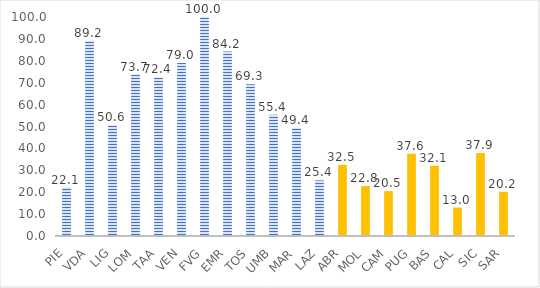
| Category | nidi e sezioni primavera |
|---|---|
| PIE | 22.1 |
| VDA | 89.2 |
| LIG | 50.6 |
| LOM | 73.7 |
| TAA | 72.4 |
| VEN | 79 |
| FVG | 100 |
| EMR | 84.2 |
| TOS | 69.3 |
| UMB | 55.4 |
| MAR | 49.4 |
| LAZ | 25.4 |
| ABR | 32.5 |
| MOL | 22.8 |
| CAM | 20.5 |
| PUG | 37.6 |
| BAS | 32.1 |
| CAL | 13 |
| SIC | 37.9 |
| SAR | 20.2 |